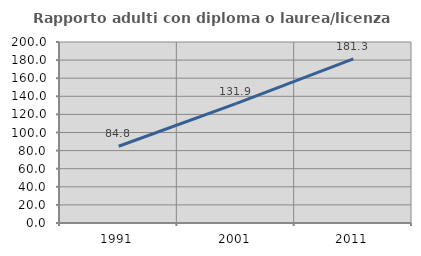
| Category | Rapporto adulti con diploma o laurea/licenza media  |
|---|---|
| 1991.0 | 84.79 |
| 2001.0 | 131.931 |
| 2011.0 | 181.301 |